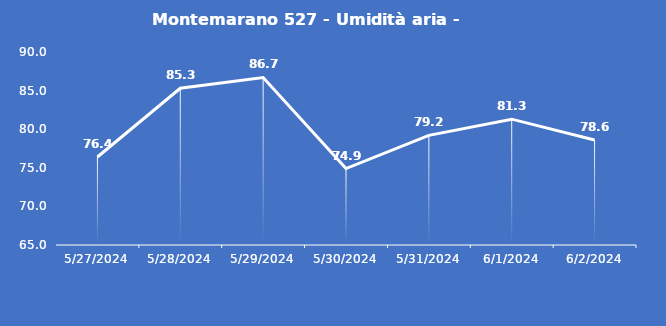
| Category | Montemarano 527 - Umidità aria - Grezzo (%) |
|---|---|
| 5/27/24 | 76.4 |
| 5/28/24 | 85.3 |
| 5/29/24 | 86.7 |
| 5/30/24 | 74.9 |
| 5/31/24 | 79.2 |
| 6/1/24 | 81.3 |
| 6/2/24 | 78.6 |